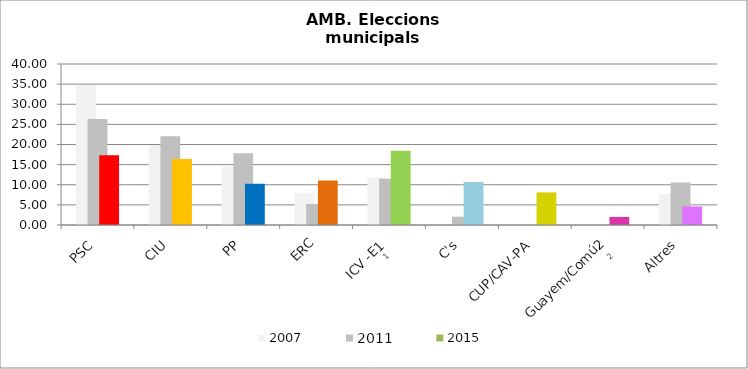
| Category | 2007 | 2011 | 2015 |
|---|---|---|---|
| PSC | 34.777 | 26.358 | 17.35 |
| CIU | 19.871 | 22.073 | 16.377 |
| PP | 14.472 | 17.822 | 10.249 |
| ERC | 7.984 | 5.221 | 11.083 |
| ICV -E1 | 11.825 | 11.49 | 18.421 |
| C's | 0 | 2.06 | 10.667 |
| CUP/CAV-PA | 0 | 0 | 8.099 |
| Guayem/Comú2 | 0 | 0 | 2.002 |
| Altres | 7.708 | 10.559 | 4.602 |